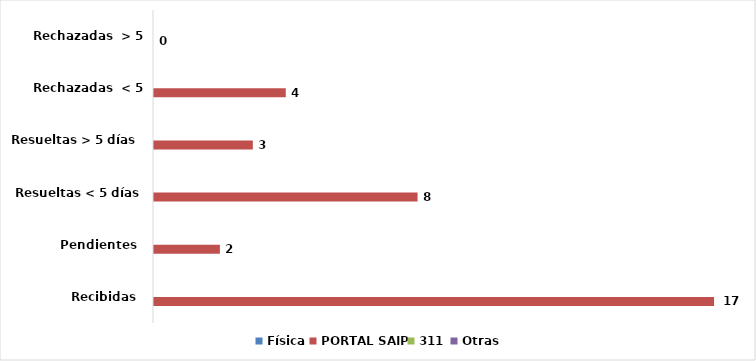
| Category | Física | PORTAL SAIP | 311 | Otras |
|---|---|---|---|---|
| Recibidas  | 0 | 17 | 0 | 0 |
| Pendientes  | 0 | 2 | 0 | 0 |
| Resueltas < 5 días | 0 | 8 | 0 | 0 |
| Resueltas > 5 días  | 0 | 3 | 0 | 0 |
| Rechazadas  < 5 días | 0 | 4 | 0 | 0 |
| Rechazadas  > 5 días | 0 | 0 | 0 | 0 |